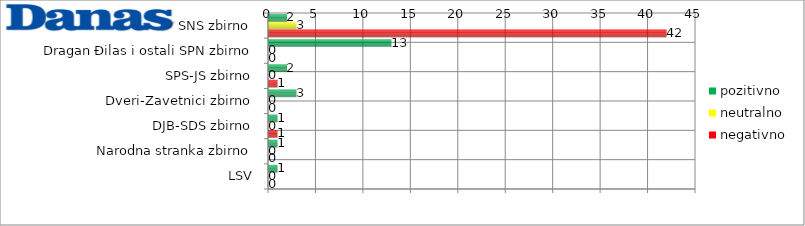
| Category | pozitivno | neutralno | negativno |
|---|---|---|---|
| Aleksandar Vučić i ostali SNS zbirno | 2 | 3 | 42 |
| Dragan Đilas i ostali SPN zbirno | 13 | 0 | 0 |
| SPS-JS zbirno | 2 | 0 | 1 |
| Dveri-Zavetnici zbirno | 3 | 0 | 0 |
| DJB-SDS zbirno | 1 | 0 | 1 |
| Narodna stranka zbirno | 1 | 0 | 0 |
| LSV | 1 | 0 | 0 |